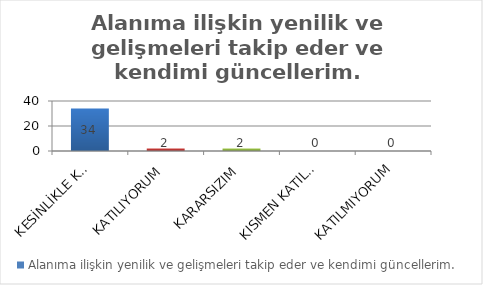
| Category | Alanıma ilişkin yenilik ve gelişmeleri takip eder ve kendimi güncellerim. |
|---|---|
| KESİNLİKLE KATILIYORUM | 34 |
| KATILIYORUM | 2 |
| KARARSIZIM | 2 |
| KISMEN KATILIYORUM | 0 |
| KATILMIYORUM | 0 |